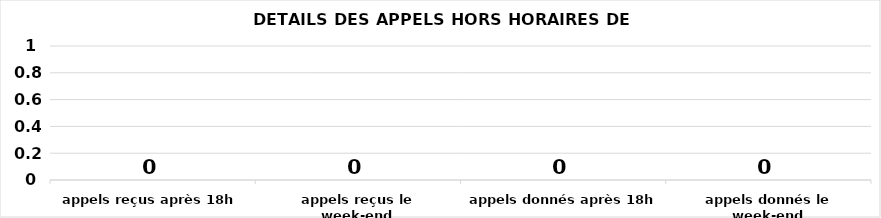
| Category | Series 0 |
|---|---|
| appels reçus après 18h | 0 |
| appels reçus le week-end | 0 |
| appels donnés après 18h | 0 |
| appels donnés le week-end | 0 |